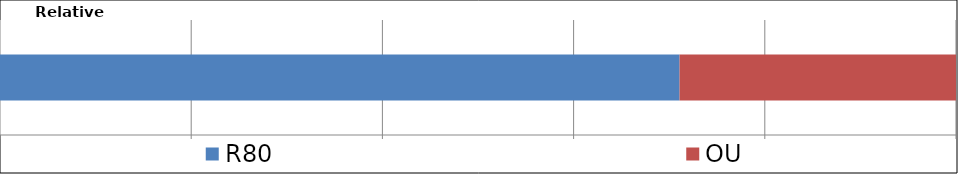
| Category | R80 | OU |
|---|---|---|
| Relative Rurality | 295 | 120 |